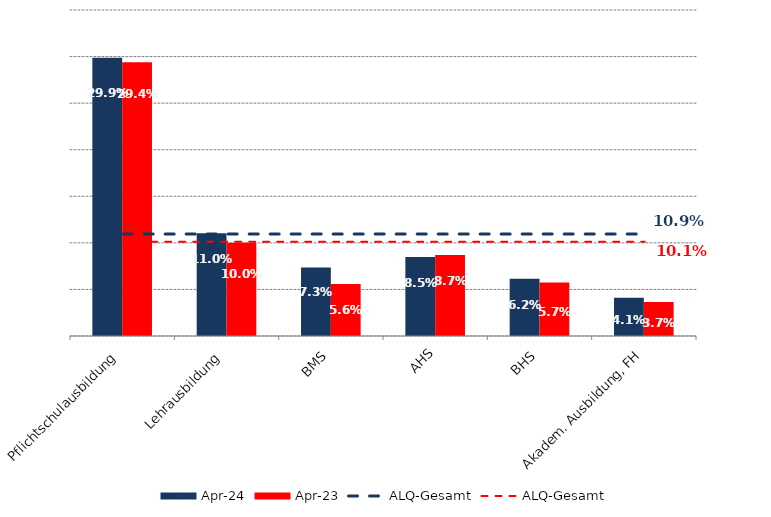
| Category | Apr 24 | Apr 23 |
|---|---|---|
| Pflichtschulausbildung | 0.299 | 0.294 |
| Lehrausbildung | 0.11 | 0.1 |
| BMS | 0.073 | 0.056 |
| AHS | 0.085 | 0.087 |
| BHS | 0.062 | 0.057 |
| Akadem. Ausbildung, FH | 0.041 | 0.037 |